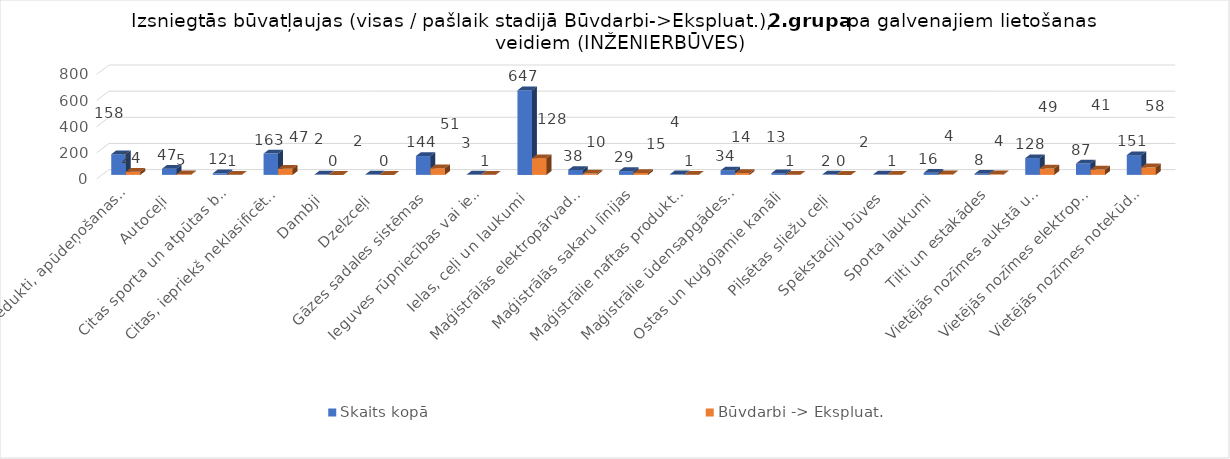
| Category | Skaits kopā | Būvdarbi -> Ekspluat. |
|---|---|---|
| Akvedukti, apūdeņošanas un meliorācijas hidrobūves | 158 | 24 |
| Autoceļi | 47 | 5 |
| Citas sporta un atpūtas būves | 12 | 1 |
| Citas, iepriekš neklasificētas, inženierbūves | 163 | 47 |
| Dambji | 2 | 0 |
| Dzelzceļi | 2 | 0 |
| Gāzes sadales sistēmas | 144 | 51 |
| Ieguves rūpniecības vai iežieguves būves | 3 | 1 |
| Ielas, ceļi un laukumi | 647 | 128 |
| Maģistrālās elektropārvades un elektrosadales līnijas | 38 | 10 |
| Maģistrālās sakaru līnijas | 29 | 15 |
| Maģistrālie naftas produktu un gāzes cauruļvadi | 4 | 1 |
| Maģistrālie ūdensapgādes cauruļvadi | 34 | 14 |
| Ostas un kuģojamie kanāli | 13 | 1 |
| Pilsētas sliežu ceļi | 2 | 0 |
| Spēkstaciju būves | 2 | 1 |
| Sporta laukumi | 16 | 4 |
| Tilti un estakādes | 8 | 4 |
| Vietējās nozīmes aukstā un karstā ūdens apgādes būves | 128 | 49 |
| Vietējās nozīmes elektropārvades un sakaru kabeļu būves | 87 | 41 |
| Vietējās nozīmes notekūdeņu cauruļvadi un attīrīšanas būves | 151 | 58 |